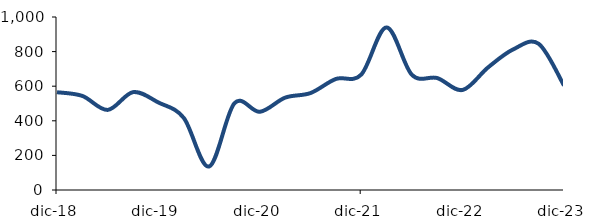
| Category | Series 0 |
|---|---|
| 2018-12-01 | 565.187 |
| 2019-03-01 | 543.772 |
| 2019-06-01 | 463.001 |
| 2019-09-01 | 565.591 |
| 2019-12-01 | 505.802 |
| 2020-03-01 | 416.78 |
| 2020-06-01 | 135.791 |
| 2020-09-01 | 501.394 |
| 2020-12-01 | 452.093 |
| 2021-03-01 | 533.822 |
| 2021-06-01 | 560.424 |
| 2021-09-01 | 641.792 |
| 2021-12-01 | 666.767 |
| 2022-03-01 | 939.85 |
| 2022-06-01 | 665.855 |
| 2022-09-01 | 646.998 |
| 2022-12-01 | 578.156 |
| 2023-03-01 | 708.075 |
| 2023-06-01 | 813.193 |
| 2023-09-01 | 845.276 |
| 2023-12-01 | 604.014 |